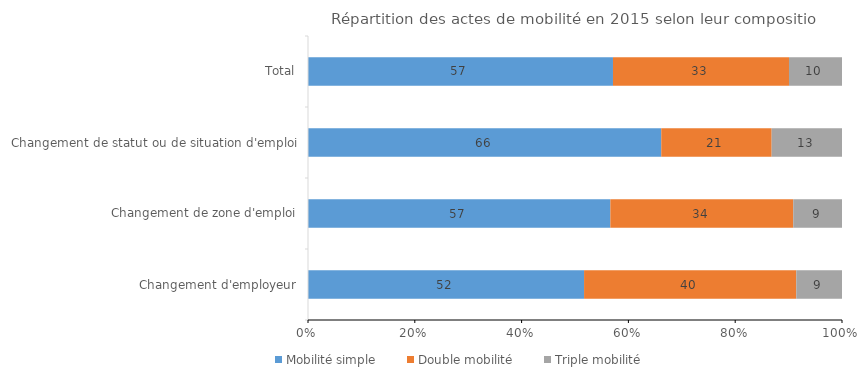
| Category | Mobilité simple | Double mobilité | Triple mobilité |
|---|---|---|---|
| Changement d'employeur | 51.698 | 39.74 | 8.562 |
| Changement de zone d'emploi | 56.618 | 34.252 | 9.13 |
| Changement de statut ou de situation d'emploi | 66.153 | 20.678 | 13.169 |
| Total | 57.112 | 32.963 | 9.925 |